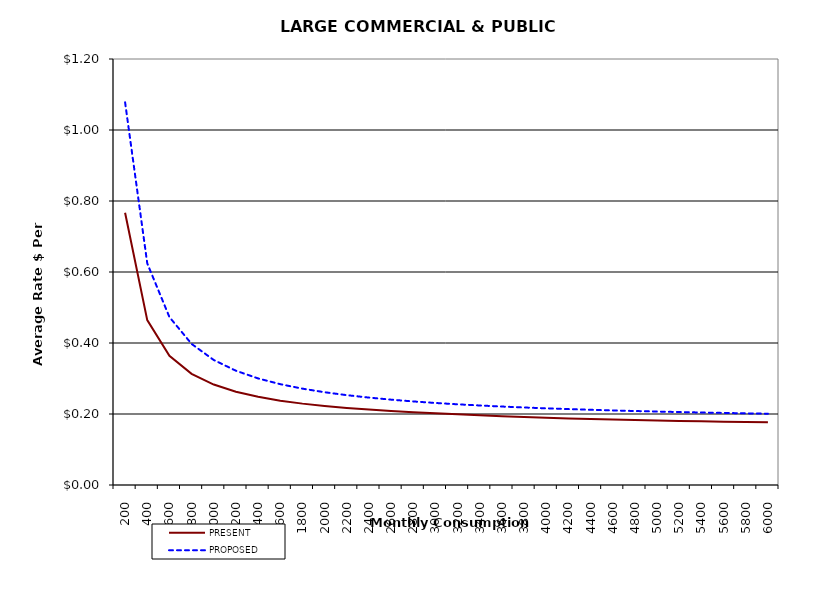
| Category | PRESENT | PROPOSED |
|---|---|---|
| 200.0 | 0.767 | 1.078 |
| 400.0 | 0.464 | 0.624 |
| 600.0 | 0.364 | 0.473 |
| 800.0 | 0.313 | 0.397 |
| 1000.0 | 0.283 | 0.352 |
| 1200.0 | 0.263 | 0.322 |
| 1400.0 | 0.248 | 0.3 |
| 1600.0 | 0.238 | 0.284 |
| 1800.0 | 0.229 | 0.271 |
| 2000.0 | 0.222 | 0.261 |
| 2200.0 | 0.217 | 0.253 |
| 2400.0 | 0.212 | 0.246 |
| 2600.0 | 0.209 | 0.24 |
| 2800.0 | 0.205 | 0.235 |
| 3000.0 | 0.202 | 0.231 |
| 3200.0 | 0.199 | 0.227 |
| 3400.0 | 0.196 | 0.224 |
| 3600.0 | 0.194 | 0.221 |
| 3800.0 | 0.191 | 0.218 |
| 4000.0 | 0.189 | 0.216 |
| 4200.0 | 0.188 | 0.214 |
| 4400.0 | 0.186 | 0.212 |
| 4600.0 | 0.184 | 0.21 |
| 4800.0 | 0.183 | 0.208 |
| 5000.0 | 0.182 | 0.207 |
| 5200.0 | 0.18 | 0.205 |
| 5400.0 | 0.179 | 0.204 |
| 5600.0 | 0.178 | 0.203 |
| 5800.0 | 0.177 | 0.202 |
| 6000.0 | 0.176 | 0.201 |